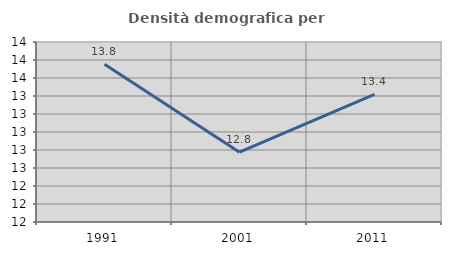
| Category | Densità demografica |
|---|---|
| 1991.0 | 13.752 |
| 2001.0 | 12.775 |
| 2011.0 | 13.417 |